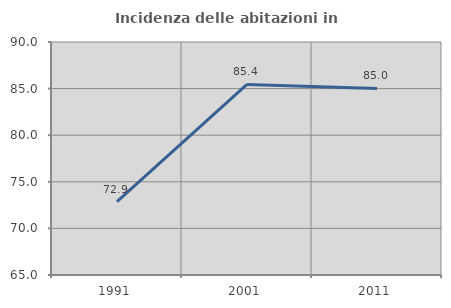
| Category | Incidenza delle abitazioni in proprietà  |
|---|---|
| 1991.0 | 72.885 |
| 2001.0 | 85.445 |
| 2011.0 | 85.024 |